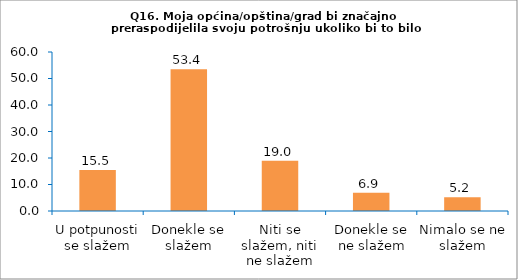
| Category | Series 0 |
|---|---|
| U potpunosti se slažem | 15.517 |
| Donekle se slažem | 53.448 |
| Niti se slažem, niti ne slažem | 18.966 |
| Donekle se ne slažem | 6.897 |
| Nimalo se ne slažem | 5.172 |